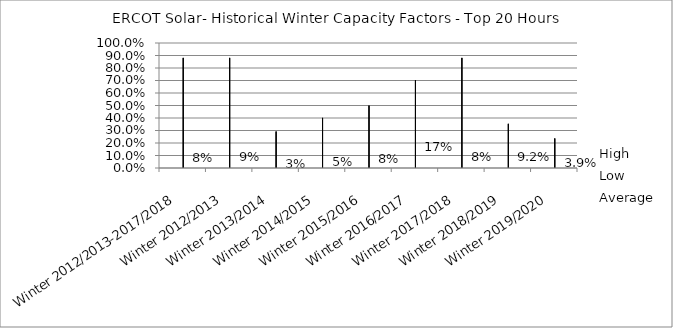
| Category | High | Low | Average |
|---|---|---|---|
| Winter 2012/2013-2017/2018 | 0.881 | 0 | 0.083 |
| Winter 2012/2013 | 0.881 | 0 | 0.089 |
| Winter 2013/2014 | 0.292 | 0 | 0.028 |
| Winter 2014/2015 | 0.401 | 0 | 0.046 |
| Winter 2015/2016 | 0.499 | 0 | 0.076 |
| Winter 2016/2017 | 0.702 | 0 | 0.171 |
| Winter 2017/2018 | 0.881 | 0 | 0.085 |
| Winter 2018/2019 | 0.353 | 0 | 0.092 |
| Winter 2019/2020 | 0.236 | 0 | 0.039 |